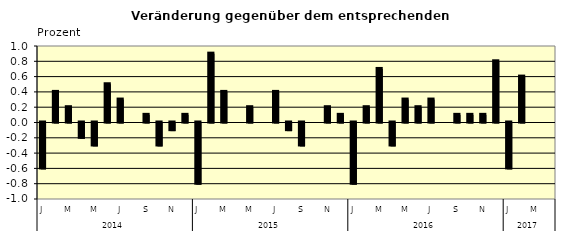
| Category | Series 0 |
|---|---|
| 0 | -0.6 |
| 1 | 0.4 |
| 2 | 0.2 |
| 3 | -0.2 |
| 4 | -0.3 |
| 5 | 0.5 |
| 6 | 0.3 |
| 7 | 0 |
| 8 | 0.1 |
| 9 | -0.3 |
| 10 | -0.1 |
| 11 | 0.1 |
| 12 | -0.8 |
| 13 | 0.9 |
| 14 | 0.4 |
| 15 | 0 |
| 16 | 0.2 |
| 17 | 0 |
| 18 | 0.4 |
| 19 | -0.1 |
| 20 | -0.3 |
| 21 | 0 |
| 22 | 0.2 |
| 23 | 0.1 |
| 24 | -0.8 |
| 25 | 0.2 |
| 26 | 0.7 |
| 27 | -0.3 |
| 28 | 0.3 |
| 29 | 0.2 |
| 30 | 0.3 |
| 31 | 0 |
| 32 | 0.1 |
| 33 | 0.1 |
| 34 | 0.1 |
| 35 | 0.8 |
| 36 | -0.6 |
| 37 | 0.6 |
| 38 | 0 |
| 39 | 0 |